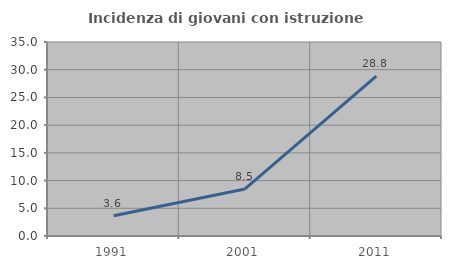
| Category | Incidenza di giovani con istruzione universitaria |
|---|---|
| 1991.0 | 3.636 |
| 2001.0 | 8.485 |
| 2011.0 | 28.829 |